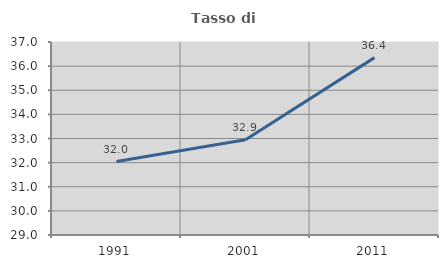
| Category | Tasso di occupazione   |
|---|---|
| 1991.0 | 32.044 |
| 2001.0 | 32.947 |
| 2011.0 | 36.352 |